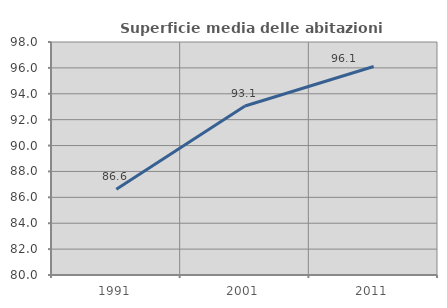
| Category | Superficie media delle abitazioni occupate |
|---|---|
| 1991.0 | 86.631 |
| 2001.0 | 93.06 |
| 2011.0 | 96.108 |